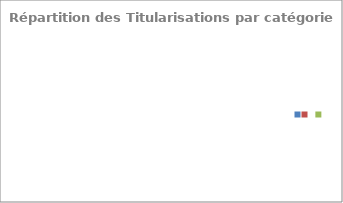
| Category | Cat. A Cat. B Cat. C |
|---|---|
| 0 | 0 |
| 1 | 0 |
| 2 | 0 |